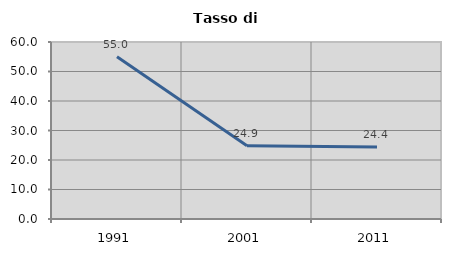
| Category | Tasso di disoccupazione   |
|---|---|
| 1991.0 | 55.025 |
| 2001.0 | 24.868 |
| 2011.0 | 24.382 |